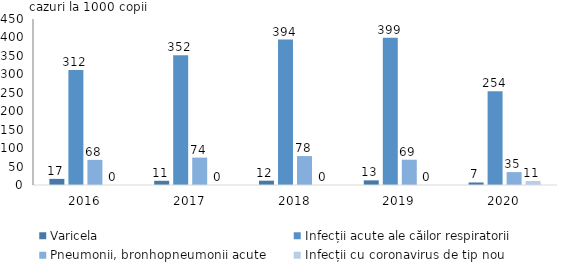
| Category | Varicela | Infecții acute ale căilor respiratorii  | Pneumonii, bronhopneumonii acute | Infecții cu coronavirus de tip nou |
|---|---|---|---|---|
| 2016.0 | 16.579 | 311.944 | 68.125 | 0 |
| 2017.0 | 11.381 | 351.98 | 74.37 | 0 |
| 2018.0 | 11.729 | 394.23 | 78.399 | 0 |
| 2019.0 | 12.59 | 399.468 | 68.529 | 0 |
| 2020.0 | 6.836 | 254.019 | 34.958 | 10.915 |